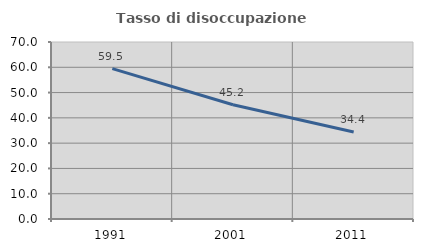
| Category | Tasso di disoccupazione giovanile  |
|---|---|
| 1991.0 | 59.494 |
| 2001.0 | 45.161 |
| 2011.0 | 34.409 |